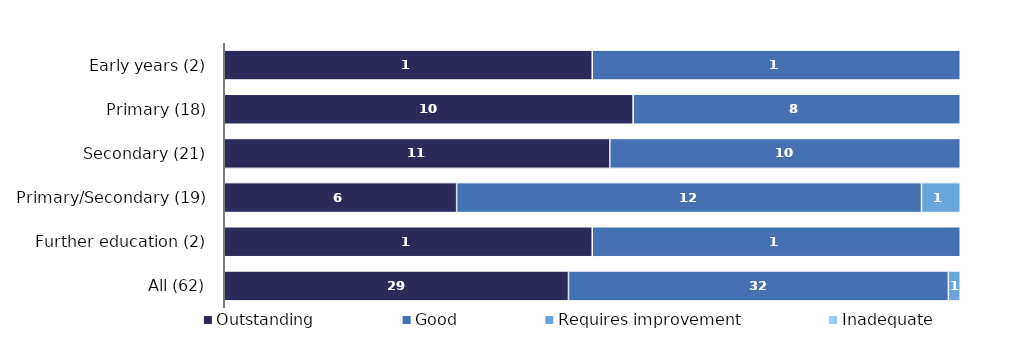
| Category | Outstanding | Good | Requires improvement | Inadequate |
|---|---|---|---|---|
| Early years (2) | 1 | 1 | 0 | 0 |
| Primary (18) | 10 | 8 | 0 | 0 |
| Secondary (21) | 11 | 10 | 0 | 0 |
| Primary/Secondary (19) | 6 | 12 | 1 | 0 |
| Further education (2) | 1 | 1 | 0 | 0 |
| All (62) | 29 | 32 | 1 | 0 |